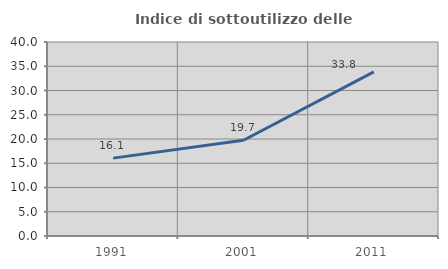
| Category | Indice di sottoutilizzo delle abitazioni  |
|---|---|
| 1991.0 | 16.057 |
| 2001.0 | 19.737 |
| 2011.0 | 33.838 |